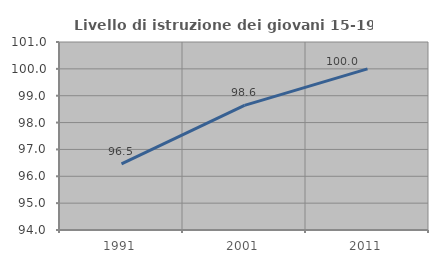
| Category | Livello di istruzione dei giovani 15-19 anni |
|---|---|
| 1991.0 | 96.465 |
| 2001.0 | 98.639 |
| 2011.0 | 100 |